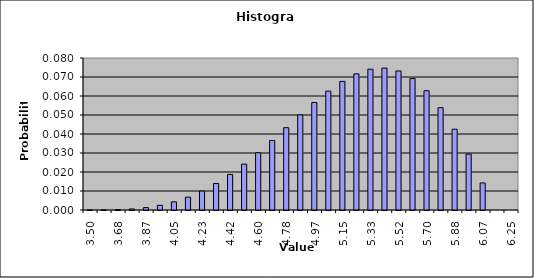
| Category | DISTRIBUTION SCHEDULE |
|---|---|
| 3.5 | 0 |
| 3.591666666666667 | 0 |
| 3.6833333333333336 | 0 |
| 3.7750000000000004 | 0.001 |
| 3.866666666666667 | 0.001 |
| 3.958333333333334 | 0.002 |
| 4.050000000000001 | 0.004 |
| 4.1416666666666675 | 0.007 |
| 4.233333333333334 | 0.01 |
| 4.325000000000001 | 0.014 |
| 4.416666666666668 | 0.019 |
| 4.508333333333335 | 0.024 |
| 4.600000000000001 | 0.03 |
| 4.691666666666668 | 0.037 |
| 4.783333333333335 | 0.043 |
| 4.875000000000002 | 0.05 |
| 4.966666666666669 | 0.057 |
| 5.058333333333335 | 0.063 |
| 5.150000000000002 | 0.068 |
| 5.241666666666669 | 0.072 |
| 5.333333333333336 | 0.074 |
| 5.4250000000000025 | 0.075 |
| 5.516666666666669 | 0.073 |
| 5.608333333333336 | 0.069 |
| 5.700000000000003 | 0.063 |
| 5.79166666666667 | 0.054 |
| 5.883333333333336 | 0.043 |
| 5.975000000000003 | 0.029 |
| 6.06666666666667 | 0.014 |
| 6.145238095238098 | 0 |
| 6.25 | 0 |